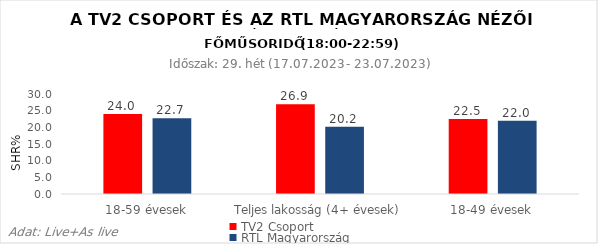
| Category | TV2 Csoport | RTL Magyarország |
|---|---|---|
| 18-59 évesek | 24 | 22.7 |
| Teljes lakosság (4+ évesek) | 26.9 | 20.2 |
| 18-49 évesek | 22.5 | 22 |